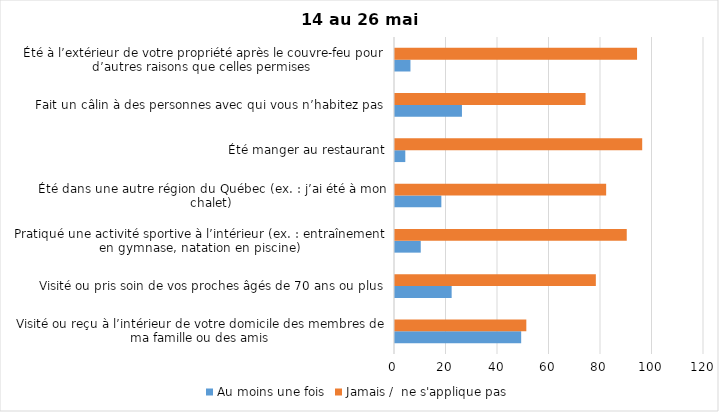
| Category | Au moins une fois | Jamais /  ne s'applique pas |
|---|---|---|
| Visité ou reçu à l’intérieur de votre domicile des membres de ma famille ou des amis | 49 | 51 |
| Visité ou pris soin de vos proches âgés de 70 ans ou plus | 22 | 78 |
| Pratiqué une activité sportive à l’intérieur (ex. : entraînement en gymnase, natation en piscine) | 10 | 90 |
| Été dans une autre région du Québec (ex. : j’ai été à mon chalet) | 18 | 82 |
| Été manger au restaurant | 4 | 96 |
| Fait un câlin à des personnes avec qui vous n’habitez pas | 26 | 74 |
| Été à l’extérieur de votre propriété après le couvre-feu pour d’autres raisons que celles permises  | 6 | 94 |